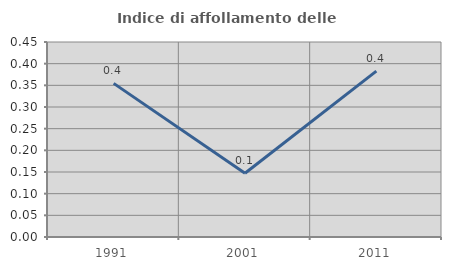
| Category | Indice di affollamento delle abitazioni  |
|---|---|
| 1991.0 | 0.355 |
| 2001.0 | 0.147 |
| 2011.0 | 0.383 |